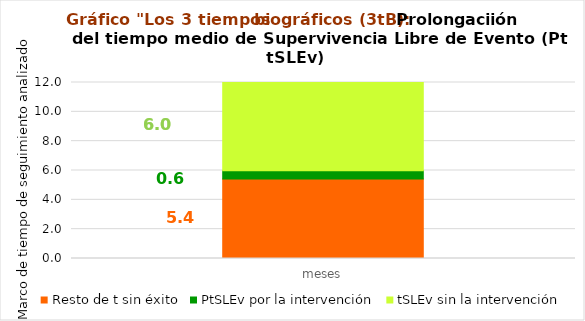
| Category | Resto de t sin éxito | PtSLEv por la intervención | tSLEv sin la intervención |
|---|---|---|---|
| meses | 5.426 | 0.551 | 6.023 |